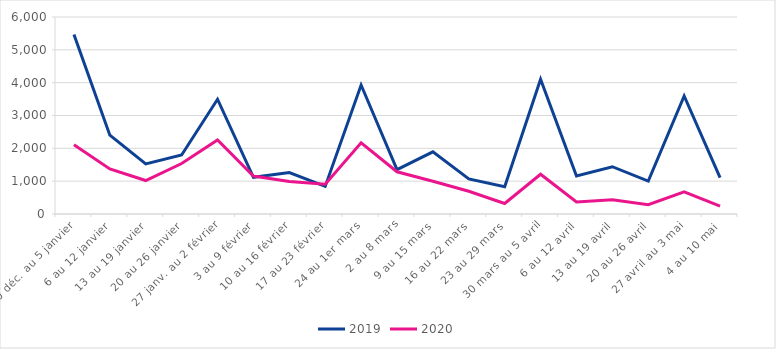
| Category | 2019 | 2020 |
|---|---|---|
| 30 déc. au 5 janvier | 5470 | 2110 |
| 6 au 12 janvier | 2400 | 1373 |
| 13 au 19 janvier | 1527 | 1019 |
| 20 au 26 janvier | 1798 | 1538 |
| 27 janv. au 2 février | 3495 | 2256 |
| 3 au 9 février | 1116 | 1158 |
| 10 au 16 février | 1260 | 989 |
| 17 au 23 février | 841 | 910 |
| 24 au 1er mars | 3928 | 2166 |
| 2 au 8 mars | 1349 | 1286 |
| 9 au 15 mars | 1893 | 998 |
| 16 au 22 mars | 1068 | 693 |
| 23 au 29 mars | 828 | 321 |
| 30 mars au 5 avril | 4105 | 1211 |
| 6 au 12 avril | 1156 | 364 |
| 13 au 19 avril | 1440 | 435 |
| 20 au 26 avril | 1002 | 285 |
| 27 avril au 3 mai | 3595 | 678 |
| 4 au 10 mai | 1106 | 238 |